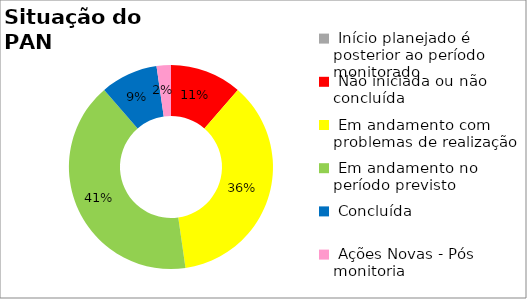
| Category | Series 0 |
|---|---|
|  Início planejado é posterior ao período monitorado | 0 |
|  Não iniciada ou não concluída | 0.114 |
|  Em andamento com problemas de realização | 0.364 |
|  Em andamento no período previsto  | 0.409 |
|  Concluída | 0.091 |
|  Ações Novas - Pós monitoria | 0.023 |